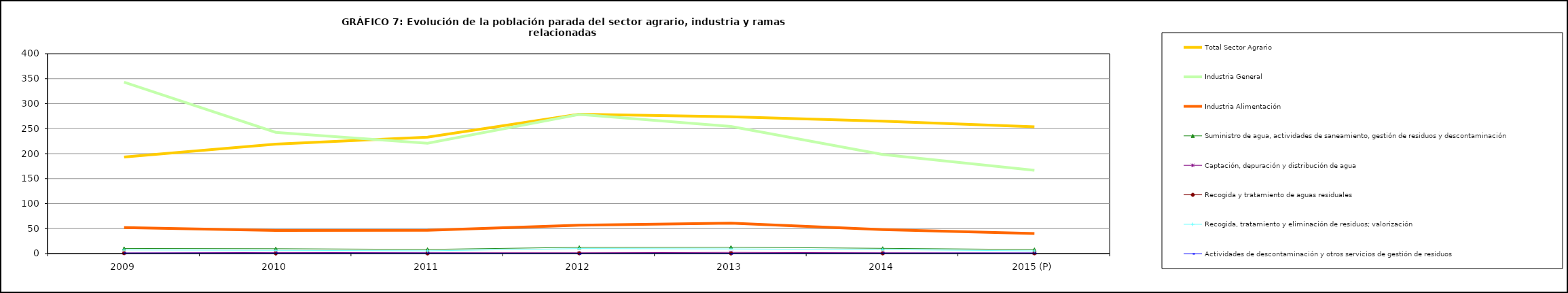
| Category | Total Sector Agrario | Industria General | Industria Alimentación | Suministro de agua, actividades de saneamiento, gestión de residuos y descontaminación  | Captación, depuración y distribución de agua         | Recogida y tratamiento de aguas residuales                                                                                 | Recogida, tratamiento y eliminación de residuos; valorización       | Actividades de descontaminación y otros servicios de gestión de residuos  |
|---|---|---|---|---|---|---|---|---|
| 2009 | 193.25 | 343.025 | 52 | 10.275 | 1.275 | 0.825 | 7.225 | 0.95 |
| 2010 | 218.925 | 242.575 | 46.15 | 9.725 | 2.25 | 0.225 | 6.475 | 0.8 |
| 2011 | 233.075 | 220.925 | 46.525 | 8.375 | 1.675 | 0.325 | 5.45 | 0.85 |
| 2012 | 278.9 | 278.675 | 56.8 | 12.475 | 1.6 | 0.5 | 9.975 | 0.45 |
| 2013 | 273.925 | 254.3 | 60.8 | 12.7 | 2.4 | 0.3 | 9.3 | 0.6 |
| 2014 | 265.1 | 198.3 | 47.85 | 10.5 | 1.6 | 0.4 | 7.9 | 0.8 |
| 2015 (P) | 253.575 | 166.725 | 40.1 | 8.1 | 1.3 | 0.5 | 5.3 | 1 |